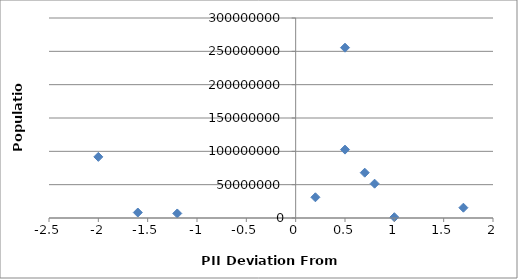
| Category | Population |
|---|---|
| 1.7000000000000002 | 15458332 |
| 1.0 | 1201542 |
| 0.5 | 255461700 |
| -1.2000000000000002 | 6803699 |
| 0.20000000000000018 | 31068000 |
| 0.7999999999999998 | 51486253 |
| 0.5 | 102580000 |
| -1.5999999999999996 | 8211700 |
| 0.7000000000000002 | 67959000 |
| -2.0 | 91700000 |